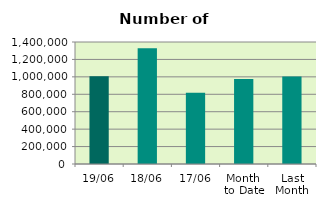
| Category | Series 0 |
|---|---|
| 19/06 | 1007142 |
| 18/06 | 1327196 |
| 17/06 | 818576 |
| Month 
to Date | 974750.769 |
| Last
Month | 1004730.273 |